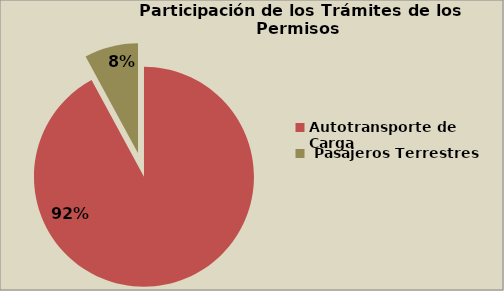
| Category | Series 0 |
|---|---|
| Autotransporte de Carga  | 92.094 |
|  Pasajeros Terrestres | 7.906 |